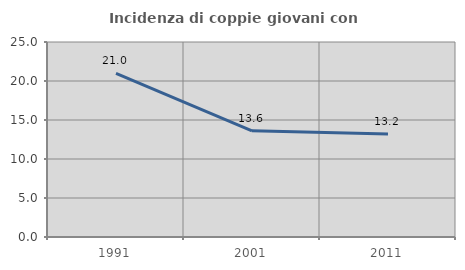
| Category | Incidenza di coppie giovani con figli |
|---|---|
| 1991.0 | 20.976 |
| 2001.0 | 13.616 |
| 2011.0 | 13.208 |